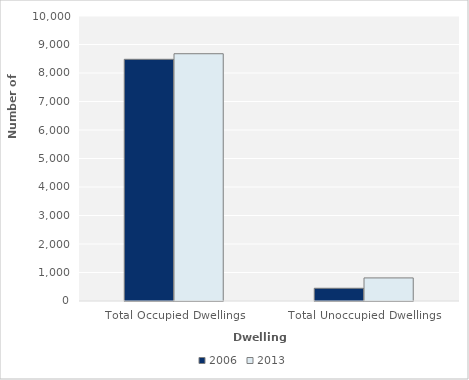
| Category | 2006 | 2013 |
|---|---|---|
| Total Occupied Dwellings | 8481 | 8676 |
| Total Unoccupied Dwellings | 447 | 810 |